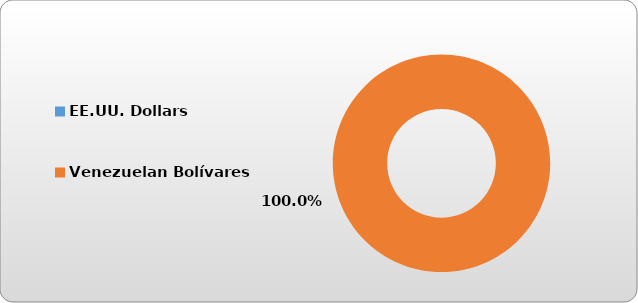
| Category | EE.UU. Dollars |
|---|---|
| EE.UU. Dollars | 0 |
| Venezuelan Bolívares | 427064.087 |